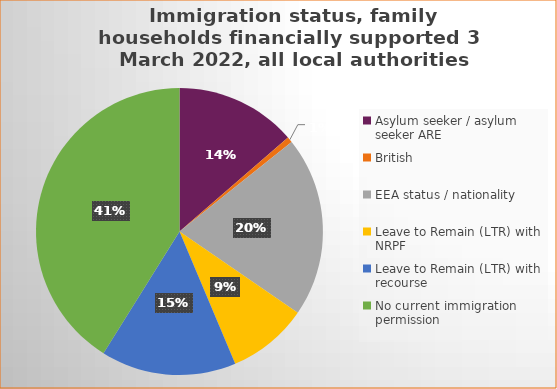
| Category | Number | Percentage |
|---|---|---|
| Asylum seeker / asylum seeker ARE | 215 | 0.136 |
| British | 10 | 0.006 |
| EEA status / nationality  | 320 | 0.203 |
| Leave to Remain (LTR) with NRPF | 143 | 0.091 |
| Leave to Remain (LTR) with recourse | 240 | 0.152 |
| No current immigration permission | 648 | 0.411 |